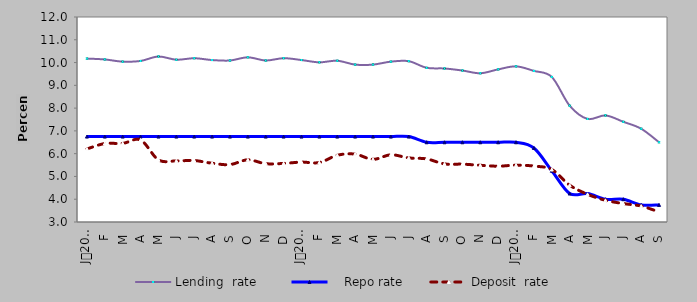
| Category | Lending  rate |    Repo rate | Deposit  rate |
|---|---|---|---|
| 0 | 10.174 | 6.75 | 6.207 |
| 1900-01-01 | 10.136 | 6.75 | 6.446 |
| 1900-01-02 | 10.04 | 6.75 | 6.45 |
| 1900-01-03 | 10.07 | 6.75 | 6.6 |
| 1900-01-04 | 10.265 | 6.75 | 5.728 |
| 1900-01-05 | 10.125 | 6.75 | 5.682 |
| 1900-01-06 | 10.19 | 6.75 | 5.7 |
| 1900-01-07 | 10.11 | 6.75 | 5.58 |
| 1900-01-08 | 10.09 | 6.75 | 5.52 |
| 1900-01-09 | 10.23 | 6.75 | 5.73 |
| 1900-01-10 | 10.09 | 6.75 | 5.56 |
| 1900-01-11 | 10.192 | 6.75 | 5.572 |
| 1900-01-12 | 10.11 | 6.75 | 5.63 |
| 1900-01-13 | 10.01 | 6.75 | 5.61 |
| 1900-01-14 | 10.08 | 6.75 | 5.93 |
| 1900-01-15 | 9.91 | 6.75 | 5.98 |
| 1900-01-16 | 9.91 | 6.75 | 5.75 |
| 1900-01-17 | 10.04 | 6.75 | 5.95 |
| 1900-01-18 | 10.06 | 6.75 | 5.813 |
| 1900-01-19 | 9.77 | 6.5 | 5.77 |
| 1900-01-20 | 9.74 | 6.5 | 5.55 |
| 1900-01-21 | 9.65 | 6.5 | 5.54 |
| 1900-01-22 | 9.53 | 6.5 | 5.49 |
| 1900-01-23 | 9.7 | 6.5 | 5.45 |
| 1900-01-24 | 9.833 | 6.5 | 5.497 |
| 1900-01-25 | 9.634 | 6.25 | 5.454 |
| 1900-01-26 | 9.369 | 5.25 | 5.304 |
| 1900-01-27 | 8.106 | 4.25 | 4.617 |
| 1900-01-28 | 7.526 | 4.25 | 4.216 |
| 1900-01-29 | 7.679 | 4 | 3.952 |
| 1900-01-30 | 7.4 | 4 | 3.81 |
| 1900-01-31 | 7.095 | 3.75 | 3.699 |
| 1900-02-01 | 6.5 | 3.75 | 3.44 |